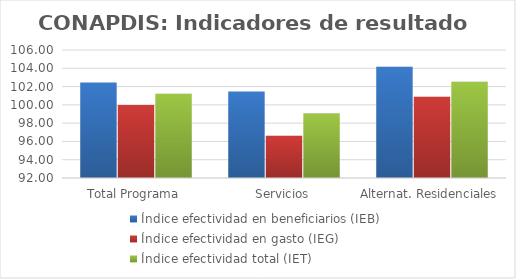
| Category | Índice efectividad en beneficiarios (IEB) | Índice efectividad en gasto (IEG)  | Índice efectividad total (IET) |
|---|---|---|---|
| Total Programa | 102.455 | 99.986 | 101.22 |
| Servicios | 101.471 | 96.622 | 99.046 |
| Alternat. Residenciales | 104.17 | 100.897 | 102.533 |